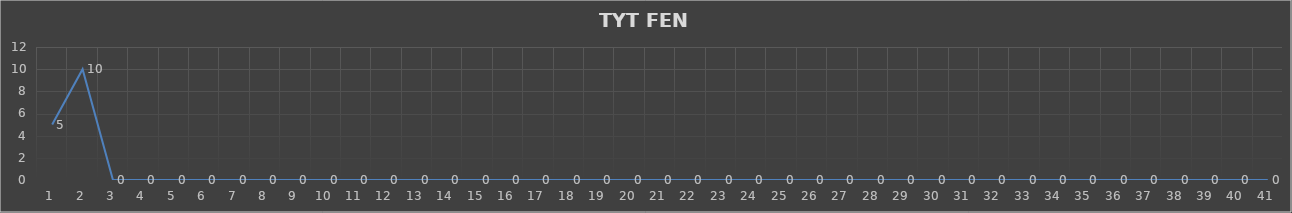
| Category | Series 0 |
|---|---|
| 0 | 5 |
| 1 | 10 |
| 2 | 0 |
| 3 | 0 |
| 4 | 0 |
| 5 | 0 |
| 6 | 0 |
| 7 | 0 |
| 8 | 0 |
| 9 | 0 |
| 10 | 0 |
| 11 | 0 |
| 12 | 0 |
| 13 | 0 |
| 14 | 0 |
| 15 | 0 |
| 16 | 0 |
| 17 | 0 |
| 18 | 0 |
| 19 | 0 |
| 20 | 0 |
| 21 | 0 |
| 22 | 0 |
| 23 | 0 |
| 24 | 0 |
| 25 | 0 |
| 26 | 0 |
| 27 | 0 |
| 28 | 0 |
| 29 | 0 |
| 30 | 0 |
| 31 | 0 |
| 32 | 0 |
| 33 | 0 |
| 34 | 0 |
| 35 | 0 |
| 36 | 0 |
| 37 | 0 |
| 38 | 0 |
| 39 | 0 |
| 40 | 0 |